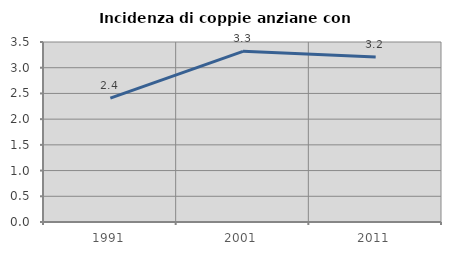
| Category | Incidenza di coppie anziane con figli |
|---|---|
| 1991.0 | 2.408 |
| 2001.0 | 3.319 |
| 2011.0 | 3.209 |